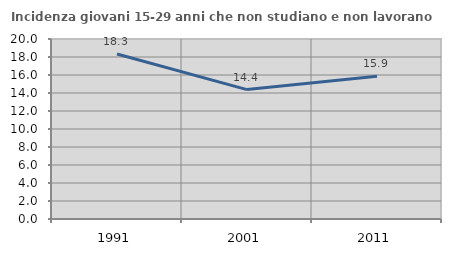
| Category | Incidenza giovani 15-29 anni che non studiano e non lavorano  |
|---|---|
| 1991.0 | 18.326 |
| 2001.0 | 14.379 |
| 2011.0 | 15.86 |